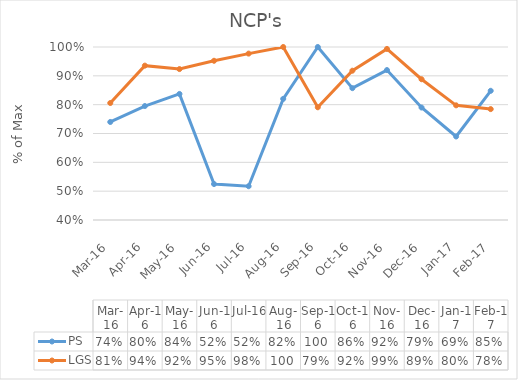
| Category | PS | LGS |
|---|---|---|
| 2016-03-16 | 0.74 | 0.806 |
| 2016-04-16 | 0.795 | 0.935 |
| 2016-05-16 | 0.837 | 0.923 |
| 2016-06-16 | 0.525 | 0.952 |
| 2016-07-16 | 0.517 | 0.977 |
| 2016-08-16 | 0.82 | 1 |
| 2016-09-16 | 1 | 0.791 |
| 2016-10-16 | 0.857 | 0.918 |
| 2016-11-16 | 0.92 | 0.993 |
| 2016-12-16 | 0.79 | 0.888 |
| 2017-01-16 | 0.69 | 0.798 |
| 2017-02-16 | 0.848 | 0.785 |